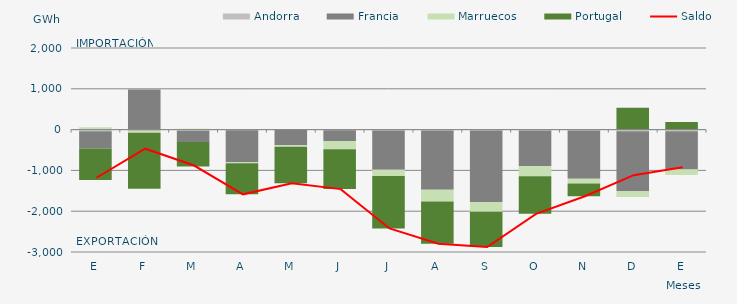
| Category | Andorra | Francia | Marruecos | Portugal |
|---|---|---|---|---|
| E | -38.484 | -427.138 | 57.119 | -771.475 |
| F | -34.803 | 984.059 | -44.168 | -1373 |
| M | -31.125 | -269.834 | 22.023 | -601.362 |
| A | -16.536 | -782.912 | -22.588 | -764.882 |
| M | -5.354 | -378.96 | -37.987 | -891.537 |
| J | -16.539 | -262.937 | -205.078 | -974.176 |
| J | -22.256 | -963.789 | -152.863 | -1283.78 |
| A | -20.355 | -1451.936 | -291.598 | -1034.215 |
| S | -19.779 | -1752.3 | -243.405 | -861.179 |
| O | -20.359 | -877.448 | -247.178 | -920.502 |
| N | -20.176 | -1184.993 | -114.159 | -314.568 |
| D | -39.88 | -1462.427 | -149.967 | 535.045 |
| E | -42.454 | -936.901 | -131.692 | 188.334 |